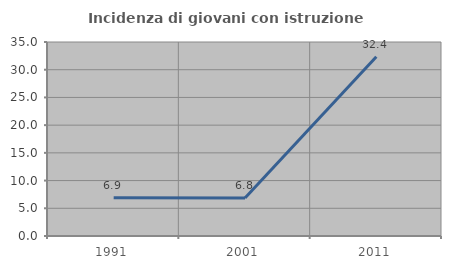
| Category | Incidenza di giovani con istruzione universitaria |
|---|---|
| 1991.0 | 6.897 |
| 2001.0 | 6.849 |
| 2011.0 | 32.353 |